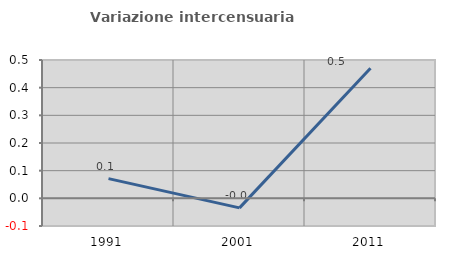
| Category | Variazione intercensuaria annua |
|---|---|
| 1991.0 | 0.071 |
| 2001.0 | -0.034 |
| 2011.0 | 0.47 |